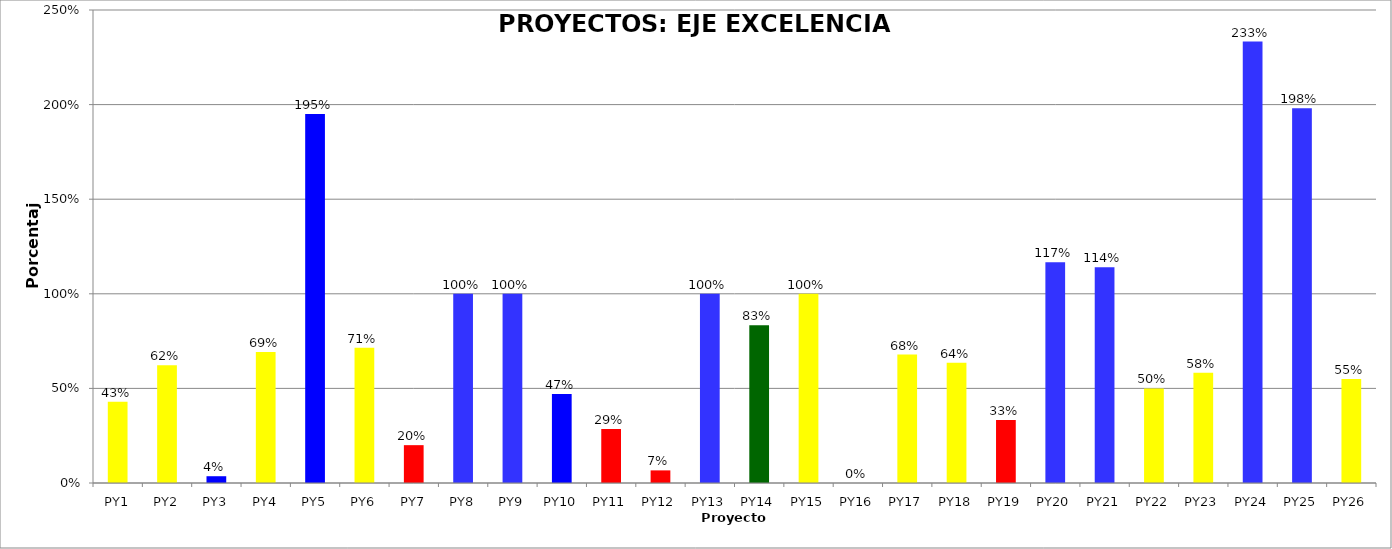
| Category | Series 0 |
|---|---|
| PY1 | 0.43 |
| PY2 | 0.623 |
| PY3 | 0.036 |
| PY4 | 0.692 |
| PY5 | 1.95 |
| PY6 | 0.714 |
| PY7 | 0.2 |
| PY8 | 1 |
| PY9 | 1 |
| PY10 | 0.471 |
| PY11 | 0.286 |
| PY12 | 0.067 |
| PY13 | 1 |
| PY14 | 0.833 |
| PY15 | 1 |
| PY16 | 0 |
| PY17 | 0.679 |
| PY18 | 0.636 |
| PY19 | 0.333 |
| PY20 | 1.167 |
| PY21 | 1.14 |
| PY22 | 0.5 |
| PY23 | 0.583 |
| PY24 | 2.333 |
| PY25 | 1.98 |
| PY26 | 0.55 |